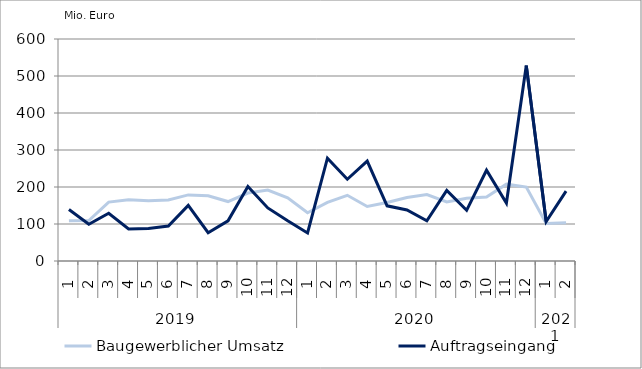
| Category | Baugewerblicher Umsatz | Auftragseingang |
|---|---|---|
| 0 | 108616.605 | 139065.287 |
| 1 | 109331.58 | 99318.609 |
| 2 | 159117.81 | 129002.041 |
| 3 | 165654.287 | 86579.2 |
| 4 | 162976.056 | 87644.362 |
| 5 | 165026.188 | 94463.186 |
| 6 | 178622.938 | 150345.08 |
| 7 | 176074.101 | 76434.317 |
| 8 | 160663.041 | 108444.162 |
| 9 | 183589.485 | 201122.697 |
| 10 | 191777.213 | 143514.792 |
| 11 | 170885.223 | 108780.022 |
| 12 | 130445.562 | 75891.481 |
| 13 | 158433.655 | 277923.85 |
| 14 | 177529.832 | 220973.626 |
| 15 | 147259.799 | 269936.091 |
| 16 | 157965.891 | 149072.895 |
| 17 | 171647.778 | 137984.76 |
| 18 | 179530.732 | 108645.965 |
| 19 | 159480.457 | 190771.468 |
| 20 | 169638.111 | 136988.906 |
| 21 | 173040.053 | 245341.603 |
| 22 | 207619.085 | 156647.224 |
| 23 | 199947.086 | 528166.004 |
| 24 | 101295.895 | 106850.127 |
| 25 | 103236.543 | 188883.434 |